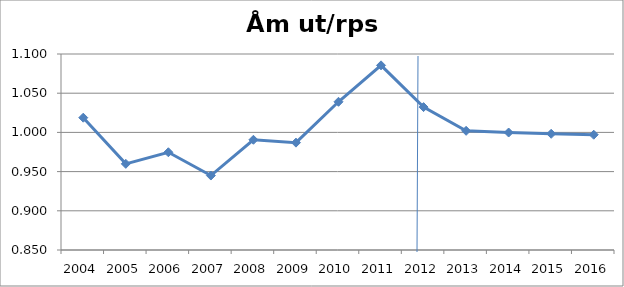
| Category | Åm ut/rps ut |
|---|---|
| 2004.0 | 1.019 |
| 2005.0 | 0.96 |
| 2006.0 | 0.975 |
| 2007.0 | 0.945 |
| 2008.0 | 0.991 |
| 2009.0 | 0.987 |
| 2010.0 | 1.039 |
| 2011.0 | 1.086 |
| 2012.0 | 1.032 |
| 2013.0 | 1.002 |
| 2014.0 | 1 |
| 2015.0 | 0.998 |
| 2016.0 | 0.997 |